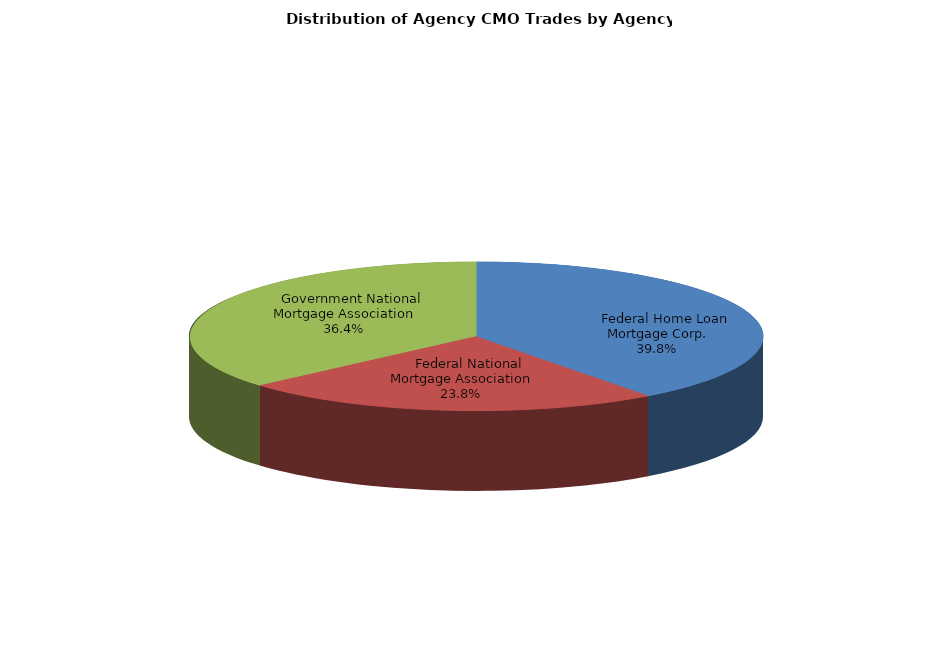
| Category | Series 0 |
|---|---|
|     Federal Home Loan Mortgage Corp. | 391.567 |
|     Federal National Mortgage Association | 234.246 |
|     Government National Mortgage Association | 358.75 |